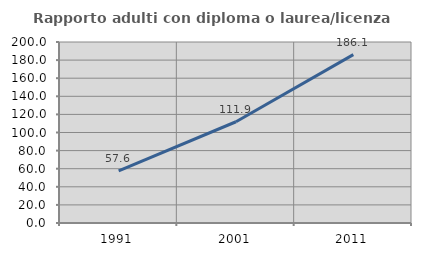
| Category | Rapporto adulti con diploma o laurea/licenza media  |
|---|---|
| 1991.0 | 57.637 |
| 2001.0 | 111.886 |
| 2011.0 | 186.053 |